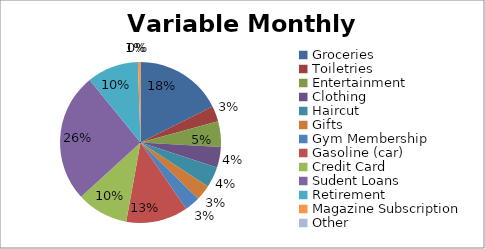
| Category | Series 0 |
|---|---|
| Groceries | 170 |
| Toiletries  | 30 |
| Entertainment  | 50 |
| Clothing  | 40 |
| Haircut | 40 |
| Gifts | 30 |
| Gym Membership | 30 |
| Gasoline (car) | 120 |
| Credit Card  | 100 |
| Sudent Loans  | 250 |
| Retirement  | 100 |
| Magazine Subscription | 5 |
| Other | 0 |